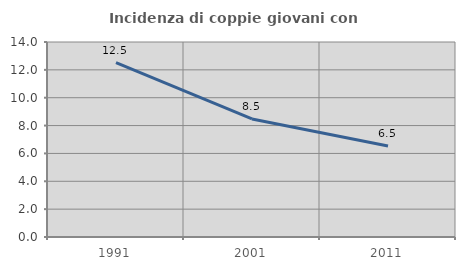
| Category | Incidenza di coppie giovani con figli |
|---|---|
| 1991.0 | 12.515 |
| 2001.0 | 8.476 |
| 2011.0 | 6.537 |